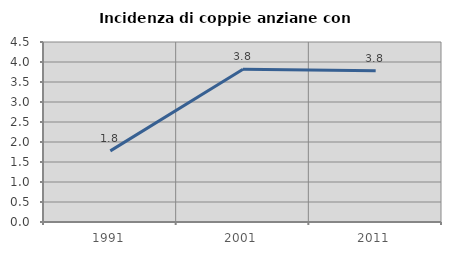
| Category | Incidenza di coppie anziane con figli |
|---|---|
| 1991.0 | 1.778 |
| 2001.0 | 3.817 |
| 2011.0 | 3.784 |